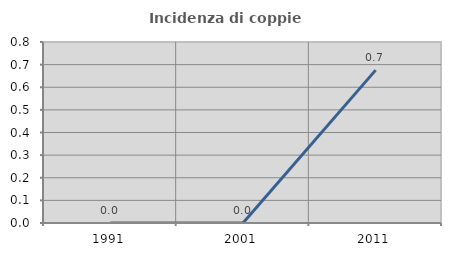
| Category | Incidenza di coppie miste |
|---|---|
| 1991.0 | 0 |
| 2001.0 | 0 |
| 2011.0 | 0.676 |